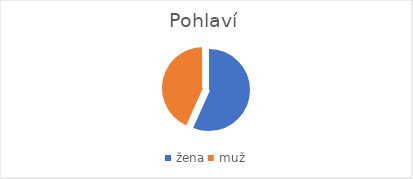
| Category | Pohlaví |
|---|---|
| žena | 148 |
| muž | 113 |